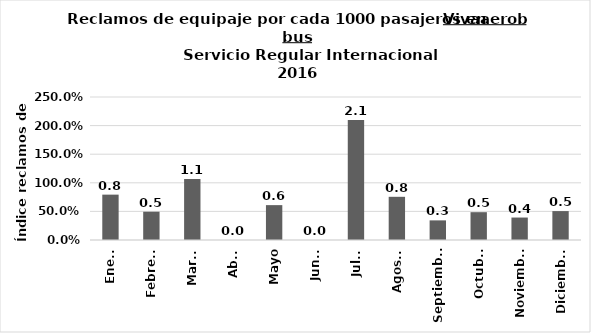
| Category | Reclamos por cada 1000 pasajeros |
|---|---|
| Enero | 0.793 |
| Febrero | 0.494 |
| Marzo | 1.068 |
| Abril | 0 |
| Mayo | 0.61 |
| Junio | 0 |
| Julio | 2.096 |
| Agosto | 0.755 |
| Septiembre | 0.343 |
| Octubre | 0.486 |
| Noviembre | 0.393 |
| Diciembre | 0.505 |